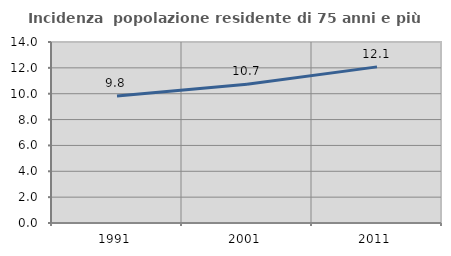
| Category | Incidenza  popolazione residente di 75 anni e più |
|---|---|
| 1991.0 | 9.816 |
| 2001.0 | 10.735 |
| 2011.0 | 12.076 |